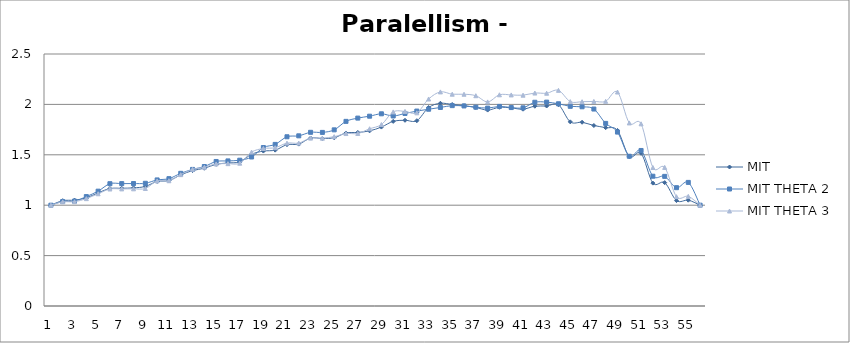
| Category | MIT | MIT THETA 2 | MIT THETA 3 |
|---|---|---|---|
| 1.0 | 1 | 1 | 1 |
| 2.0 | 1.045 | 1.037 | 1.033 |
| 3.0 | 1.05 | 1.04 | 1.035 |
| 4.0 | 1.073 | 1.086 | 1.065 |
| 5.0 | 1.122 | 1.139 | 1.114 |
| 6.0 | 1.165 | 1.213 | 1.161 |
| 7.0 | 1.168 | 1.214 | 1.162 |
| 8.0 | 1.172 | 1.215 | 1.162 |
| 9.0 | 1.186 | 1.217 | 1.166 |
| 10.0 | 1.236 | 1.251 | 1.241 |
| 11.0 | 1.244 | 1.263 | 1.243 |
| 12.0 | 1.301 | 1.316 | 1.303 |
| 13.0 | 1.343 | 1.355 | 1.356 |
| 14.0 | 1.367 | 1.384 | 1.377 |
| 15.0 | 1.406 | 1.434 | 1.41 |
| 16.0 | 1.419 | 1.439 | 1.412 |
| 17.0 | 1.43 | 1.446 | 1.417 |
| 18.0 | 1.505 | 1.478 | 1.527 |
| 19.0 | 1.537 | 1.572 | 1.563 |
| 20.0 | 1.546 | 1.603 | 1.571 |
| 21.0 | 1.6 | 1.679 | 1.616 |
| 22.0 | 1.606 | 1.688 | 1.616 |
| 23.0 | 1.666 | 1.723 | 1.666 |
| 24.0 | 1.662 | 1.722 | 1.665 |
| 25.0 | 1.669 | 1.748 | 1.68 |
| 26.0 | 1.717 | 1.832 | 1.711 |
| 27.0 | 1.722 | 1.864 | 1.711 |
| 28.0 | 1.738 | 1.883 | 1.758 |
| 29.0 | 1.775 | 1.907 | 1.8 |
| 30.0 | 1.832 | 1.885 | 1.926 |
| 31.0 | 1.843 | 1.91 | 1.93 |
| 32.0 | 1.838 | 1.934 | 1.916 |
| 33.0 | 1.969 | 1.952 | 2.054 |
| 34.0 | 2.011 | 1.97 | 2.124 |
| 35.0 | 1.999 | 1.988 | 2.101 |
| 36.0 | 1.987 | 1.985 | 2.101 |
| 37.0 | 1.97 | 1.972 | 2.086 |
| 38.0 | 1.944 | 1.963 | 2.025 |
| 39.0 | 1.971 | 1.98 | 2.095 |
| 40.0 | 1.965 | 1.969 | 2.094 |
| 41.0 | 1.952 | 1.966 | 2.092 |
| 42.0 | 1.982 | 2.021 | 2.113 |
| 43.0 | 1.984 | 2.022 | 2.111 |
| 44.0 | 1.997 | 2.006 | 2.139 |
| 45.0 | 1.827 | 1.981 | 2.028 |
| 46.0 | 1.823 | 1.976 | 2.027 |
| 47.0 | 1.791 | 1.954 | 2.03 |
| 48.0 | 1.77 | 1.811 | 2.03 |
| 49.0 | 1.742 | 1.725 | 2.123 |
| 50.0 | 1.483 | 1.486 | 1.816 |
| 51.0 | 1.515 | 1.543 | 1.807 |
| 52.0 | 1.219 | 1.287 | 1.374 |
| 53.0 | 1.224 | 1.286 | 1.375 |
| 54.0 | 1.046 | 1.174 | 1.085 |
| 55.0 | 1.05 | 1.226 | 1.088 |
| 56.0 | 1 | 1 | 1 |